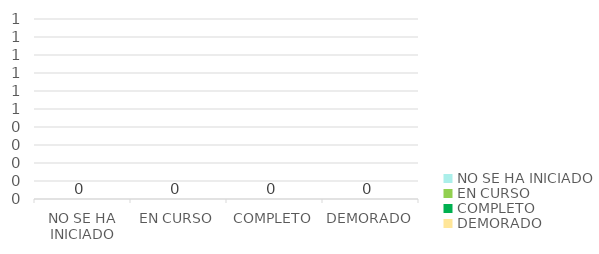
| Category | Series 0 |
|---|---|
| NO SE HA INICIADO | 0 |
| EN CURSO | 0 |
| COMPLETO | 0 |
| DEMORADO | 0 |